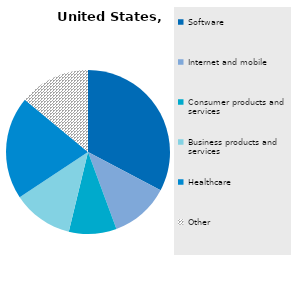
| Category | Series 0 |
|---|---|
| Software | 32.7 |
| Internet and mobile | 11.66 |
| Consumer products and services | 9.41 |
| Business products and services | 11.91 |
| Healthcare | 20.34 |
| Other | 13.98 |